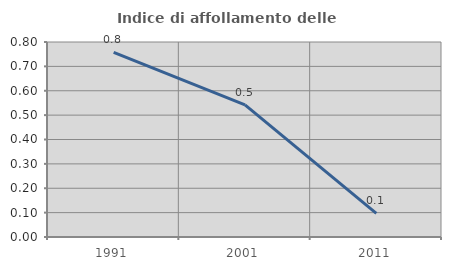
| Category | Indice di affollamento delle abitazioni  |
|---|---|
| 1991.0 | 0.758 |
| 2001.0 | 0.542 |
| 2011.0 | 0.097 |